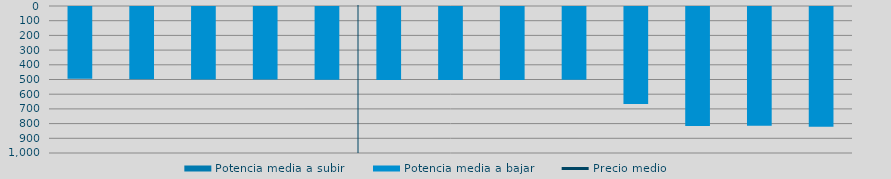
| Category | Potencia media a subir | Potencia media a bajar |
|---|---|---|
| 0 |  | 487.609 |
| 1 |  | 490.681 |
| 2 |  | 493.046 |
| 3 |  | 494.01 |
| 4 |  | 494.269 |
| 5 |  | 496 |
| 6 |  | 495.792 |
| 7 |  | 497.176 |
| 8 |  | 494.972 |
| 9 |  | 660 |
| 10 |  | 809.502 |
| 11 |  | 808.05 |
| 12 |  | 814.726 |